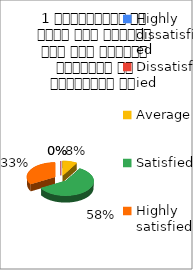
| Category | 1 व्याख्यान से रूचि में वृद्धि हुई एवं शिक्षण जानकारी से परिपूर्ण था  |
|---|---|
| Highly dissatisfied | 0 |
| Dissatisfied | 0 |
| Average | 2 |
| Satisfied | 14 |
| Highly satisfied | 8 |